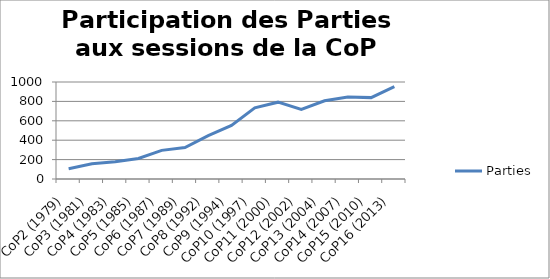
| Category | Parties |
|---|---|
| CoP2 (1979) | 106 |
| CoP3 (1981) | 157 |
| CoP4 (1983) | 179 |
| CoP5 (1985) | 211 |
| CoP6 (1987) | 295 |
| CoP7 (1989) | 325 |
| CoP8 (1992) | 447 |
| CoP9 (1994) | 553 |
| CoP10 (1997) | 733 |
| CoP11 (2000) | 792 |
| CoP12 (2002) | 718 |
| CoP13 (2004) | 806 |
| CoP14 (2007) | 845 |
| CoP15 (2010) | 839 |
| CoP16 (2013) | 952 |